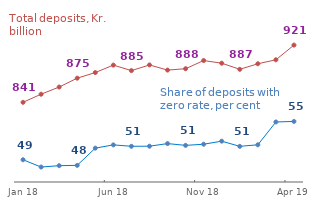
| Category | Series 0 |
|---|---|
| 2018-01-01 | 48.521 |
| 2018-02-01 | 47.368 |
| 2018-03-01 | 47.583 |
| 2018-04-01 | 47.637 |
| 2018-05-01 | 50.357 |
| 2018-06-01 | 50.872 |
| 2018-07-01 | 50.651 |
| 2018-08-01 | 50.664 |
| 2018-09-01 | 51.078 |
| 2018-10-01 | 50.794 |
| 2018-11-01 | 50.976 |
| 2018-12-01 | 51.462 |
| 2019-01-01 | 50.643 |
| 2019-02-01 | 50.889 |
| 2019-03-01 | 54.498 |
| 2019-04-01 | 54.583 |